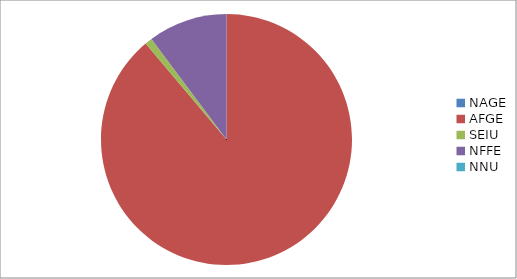
| Category | Series 0 |
|---|---|
| NAGE | 0 |
| AFGE | 16484 |
| SEIU | 175 |
| NFFE | 1893 |
| NNU | 0 |